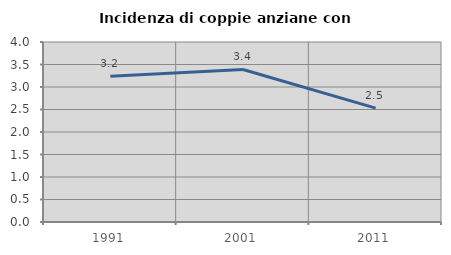
| Category | Incidenza di coppie anziane con figli |
|---|---|
| 1991.0 | 3.237 |
| 2001.0 | 3.39 |
| 2011.0 | 2.532 |